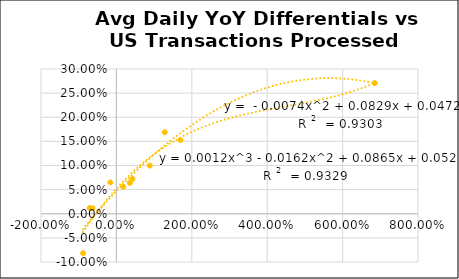
| Category | Series 0 |
|---|---|
| 0.182258118767073 | 0.056 |
| 0.35915370629323756 | 0.064 |
| 0.8835938768873242 | 0.1 |
| 1.2821123747211711 | 0.169 |
| 1.7002026948728959 | 0.153 |
| 6.8522391004789815 | 0.271 |
| 0.42496204218345973 | 0.072 |
| -0.6328080472438434 | 0.012 |
| -0.70777259914242 | 0.012 |
| -0.8843236477116111 | -0.082 |
| -0.1603136060088026 | 0.065 |